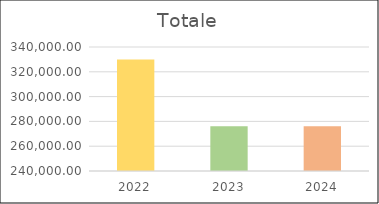
| Category | Series 0 |
|---|---|
| 2022.0 | 330000 |
| 2023.0 | 276000 |
| 2024.0 | 276000 |